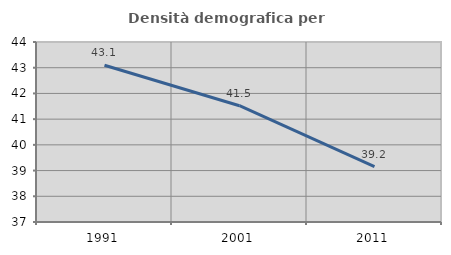
| Category | Densità demografica |
|---|---|
| 1991.0 | 43.094 |
| 2001.0 | 41.521 |
| 2011.0 | 39.154 |